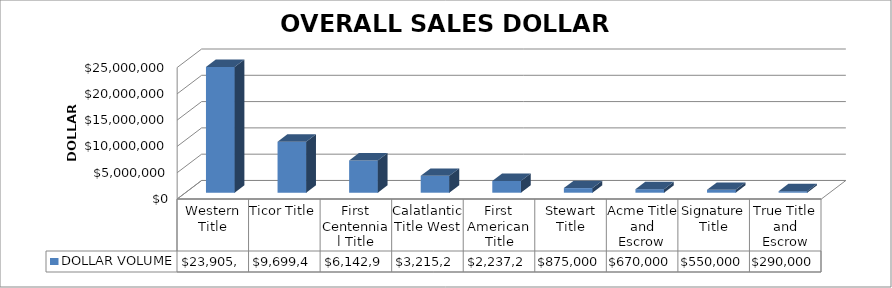
| Category | DOLLAR VOLUME |
|---|---|
| Western Title | 23905141.06 |
| Ticor Title | 9699498 |
| First Centennial Title | 6142916 |
| Calatlantic Title West | 3215266 |
| First American Title | 2237227 |
| Stewart Title | 875000 |
| Acme Title and Escrow | 670000 |
| Signature Title | 550000 |
| True Title and Escrow | 290000 |